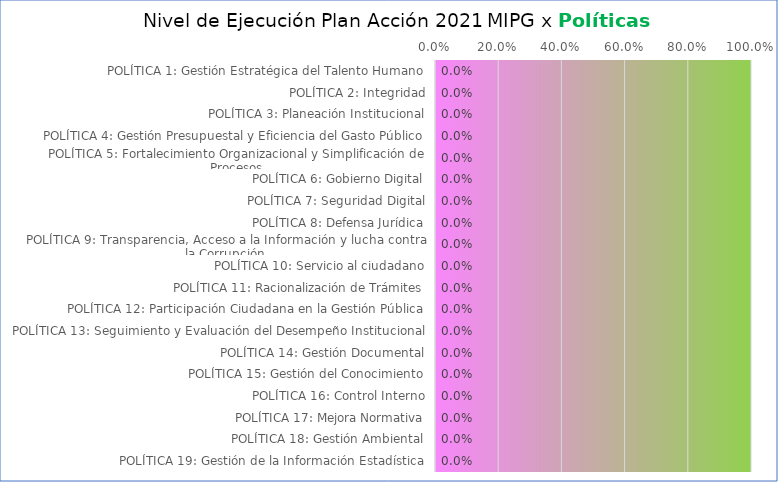
| Category | Series 0 |
|---|---|
| POLÍTICA 1: Gestión Estratégica del Talento Humano | 0 |
| POLÍTICA 2: Integridad | 0 |
| POLÍTICA 3: Planeación Institucional | 0 |
| POLÍTICA 4: Gestión Presupuestal y Eficiencia del Gasto Público | 0 |
| POLÍTICA 5: Fortalecimiento Organizacional y Simplificación de Procesos | 0 |
| POLÍTICA 6: Gobierno Digital | 0 |
| POLÍTICA 7: Seguridad Digital | 0 |
| POLÍTICA 8: Defensa Jurídica | 0 |
| POLÍTICA 9: Transparencia, Acceso a la Información y lucha contra la Corrupción | 0 |
| POLÍTICA 10: Servicio al ciudadano | 0 |
| POLÍTICA 11: Racionalización de Trámites | 0 |
| POLÍTICA 12: Participación Ciudadana en la Gestión Pública | 0 |
| POLÍTICA 13: Seguimiento y Evaluación del Desempeño Institucional | 0 |
| POLÍTICA 14: Gestión Documental | 0 |
| POLÍTICA 15: Gestión del Conocimiento | 0 |
| POLÍTICA 16: Control Interno | 0 |
| POLÍTICA 17: Mejora Normativa | 0 |
| POLÍTICA 18: Gestión Ambiental | 0 |
| POLÍTICA 19: Gestión de la Información Estadística | 0 |